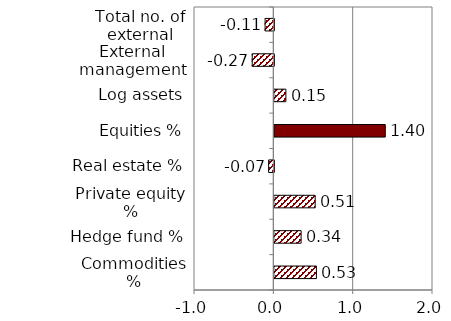
| Category | Series 1 |
|---|---|
| Commodities % | 0.53 |
| Hedge fund % | 0.338 |
| Private equity % | 0.515 |
| Real estate % | -0.066 |
| Equities % | 1.398 |
| Log assets | 0.146 |
| External management only | -0.272 |
| Total no. of external managers | -0.11 |